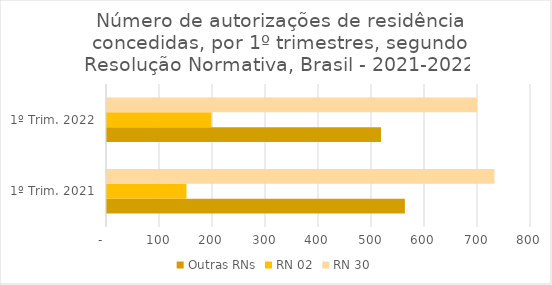
| Category | Outras RNs | RN 02 | RN 30 |
|---|---|---|---|
| 1º Trim. 2021 | 562 | 150 | 731 |
| 1º Trim. 2022 | 517 | 197 | 698 |